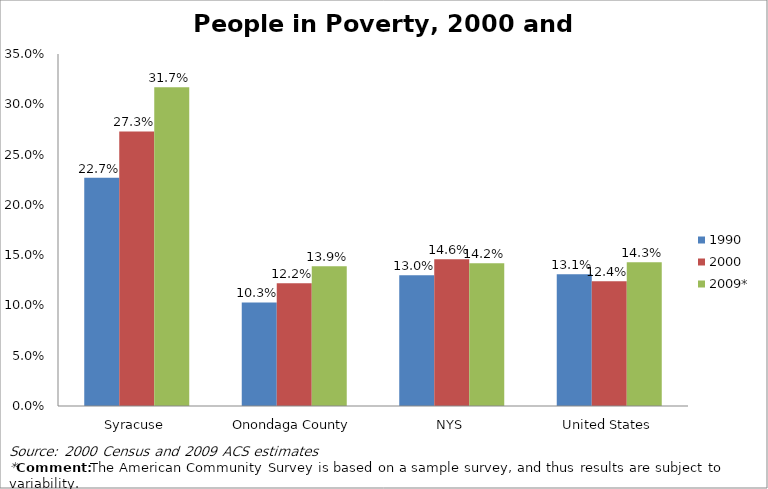
| Category | 1990 | 2000 | 2009* |
|---|---|---|---|
| Syracuse | 0.227 | 0.273 | 0.317 |
| Onondaga County | 0.103 | 0.122 | 0.139 |
| NYS | 0.13 | 0.146 | 0.142 |
| United States | 0.131 | 0.124 | 0.143 |